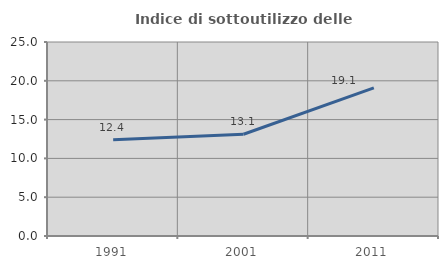
| Category | Indice di sottoutilizzo delle abitazioni  |
|---|---|
| 1991.0 | 12.393 |
| 2001.0 | 13.108 |
| 2011.0 | 19.093 |